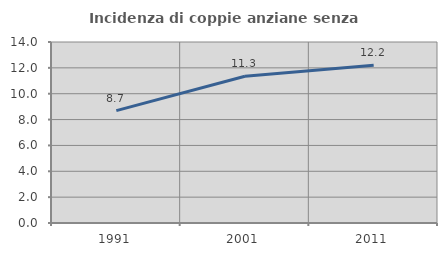
| Category | Incidenza di coppie anziane senza figli  |
|---|---|
| 1991.0 | 8.689 |
| 2001.0 | 11.348 |
| 2011.0 | 12.209 |